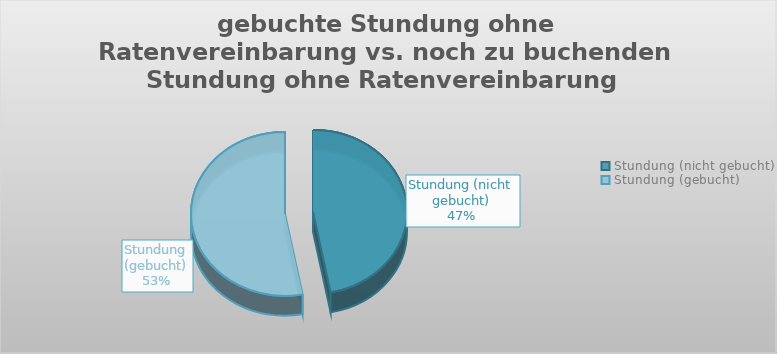
| Category | Series 0 |
|---|---|
| Stundung (nicht gebucht) | 4700 |
| Stundung (gebucht) | 5300 |